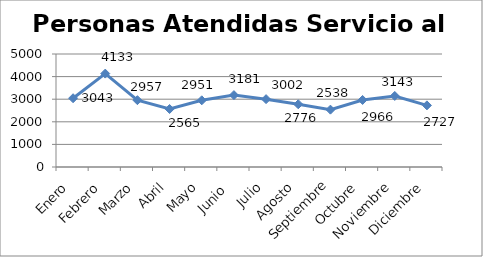
| Category | Personas Atendidas Servicio al Usuario |
|---|---|
| Enero | 3043 |
| Febrero | 4133 |
| Marzo | 2957 |
| Abril  | 2565 |
| Mayo | 2951 |
| Junio  | 3181 |
| Julio | 3002 |
| Agosto | 2776 |
| Septiembre | 2538 |
| Octubre | 2966 |
| Noviembre | 3143 |
| Diciembre | 2727 |